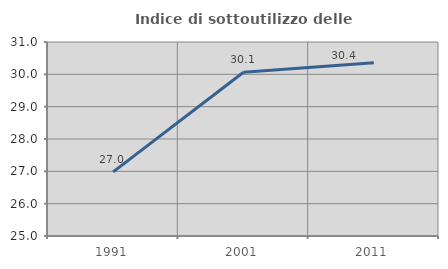
| Category | Indice di sottoutilizzo delle abitazioni  |
|---|---|
| 1991.0 | 26.984 |
| 2001.0 | 30.065 |
| 2011.0 | 30.36 |